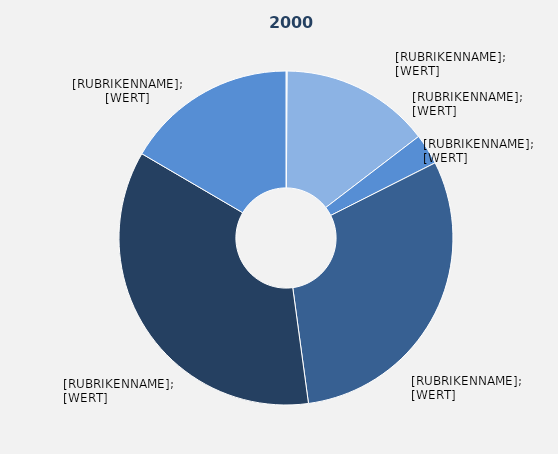
| Category | Series 1 |
|---|---|
| Land- und Forstwirtschaft, Fischerei | 0.115 |
| Produzierendes Gewerbe ohne Baugewerbe | 14.484 |
| Baugewerbe | 2.972 |
| Handel, Verkehr und Lagerei, Gastgewerbe, 
Information und Kommunikation | 30.279 |
| Finanz-, Versicherungs- und 
Unternehmensdienstleister, 
Grundstücks- und Wohnungswesen | 35.57 |
| Öffentliche und sonstige 
Dienstleister, Erziehung, 
Unterricht | 16.58 |